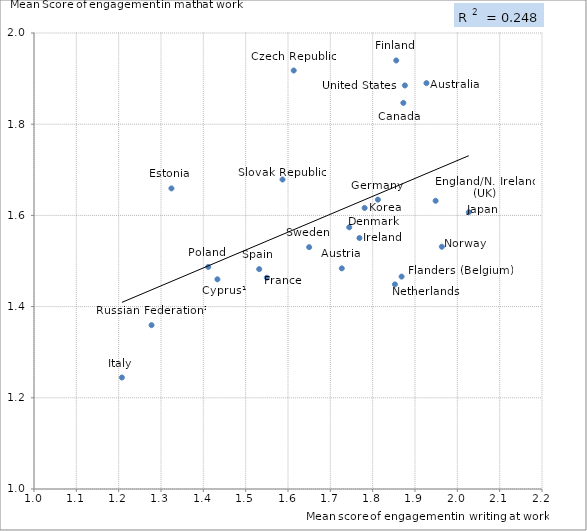
| Category | Series 1 |
|---|---|
| 1.9270198309692357 | 1.89 |
| 1.7270722840422494 | 1.484 |
| 1.8724716767188916 | 1.847 |
| 1.4332438623287271 | 1.46 |
| 1.6135221332350853 | 1.918 |
| 1.7446716407701155 | 1.574 |
| 1.9487060837922954 | 1.632 |
| 1.3246539676159763 | 1.659 |
| 1.8556978934834207 | 1.94 |
| 1.8683231822364466 | 1.466 |
| 1.5500575706075843 | 1.463 |
| 1.8123452788931909 | 1.635 |
| 1.7687651871622154 | 1.55 |
| 1.2076110106243045 | 1.244 |
| 2.0270028528803636 | 1.607 |
| 1.7810427943975364 | 1.616 |
| 1.8525450433234782 | 1.449 |
| 1.963386125727383 | 1.531 |
| 1.4114839893727305 | 1.487 |
| 1.2776383310406783 | 1.359 |
| 1.587032061765157 | 1.679 |
| 1.5319320012780384 | 1.482 |
| 1.6499457045749357 | 1.53 |
| 1.8760807544649376 | 1.885 |